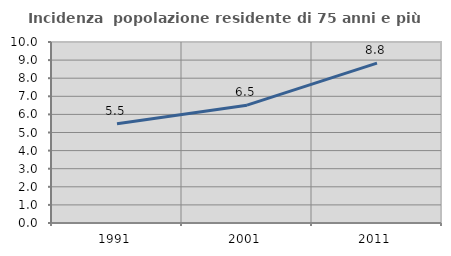
| Category | Incidenza  popolazione residente di 75 anni e più |
|---|---|
| 1991.0 | 5.483 |
| 2001.0 | 6.511 |
| 2011.0 | 8.829 |